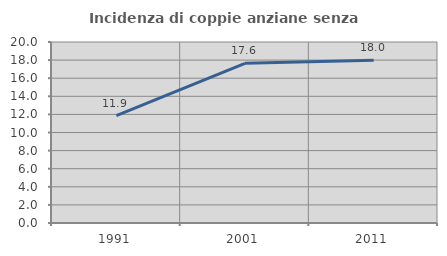
| Category | Incidenza di coppie anziane senza figli  |
|---|---|
| 1991.0 | 11.867 |
| 2001.0 | 17.647 |
| 2011.0 | 17.978 |